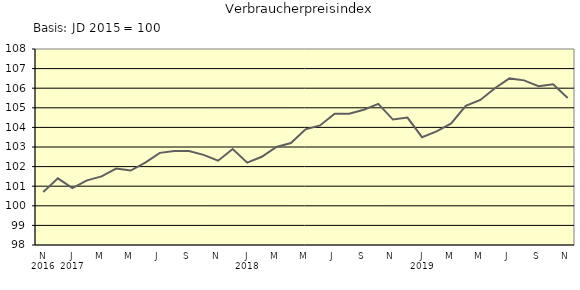
| Category | Series 0 |
|---|---|
| 0 | 100.7 |
| 1 | 101.4 |
| 2 | 100.9 |
| 3 | 101.3 |
| 4 | 101.5 |
| 5 | 101.9 |
| 6 | 101.8 |
| 7 | 102.2 |
| 8 | 102.7 |
| 9 | 102.8 |
| 10 | 102.8 |
| 11 | 102.6 |
| 12 | 102.3 |
| 13 | 102.9 |
| 14 | 102.2 |
| 15 | 102.5 |
| 16 | 103 |
| 17 | 103.2 |
| 18 | 103.9 |
| 19 | 104.1 |
| 20 | 104.7 |
| 21 | 104.7 |
| 22 | 104.9 |
| 23 | 105.2 |
| 24 | 104.4 |
| 25 | 104.5 |
| 26 | 103.5 |
| 27 | 103.8 |
| 28 | 104.2 |
| 29 | 105.1 |
| 30 | 105.4 |
| 31 | 106 |
| 32 | 106.5 |
| 33 | 106.4 |
| 34 | 106.1 |
| 35 | 106.2 |
| 36 | 105.5 |